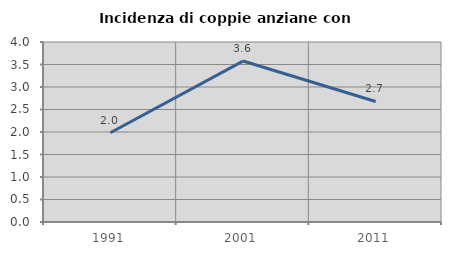
| Category | Incidenza di coppie anziane con figli |
|---|---|
| 1991.0 | 1.984 |
| 2001.0 | 3.577 |
| 2011.0 | 2.678 |